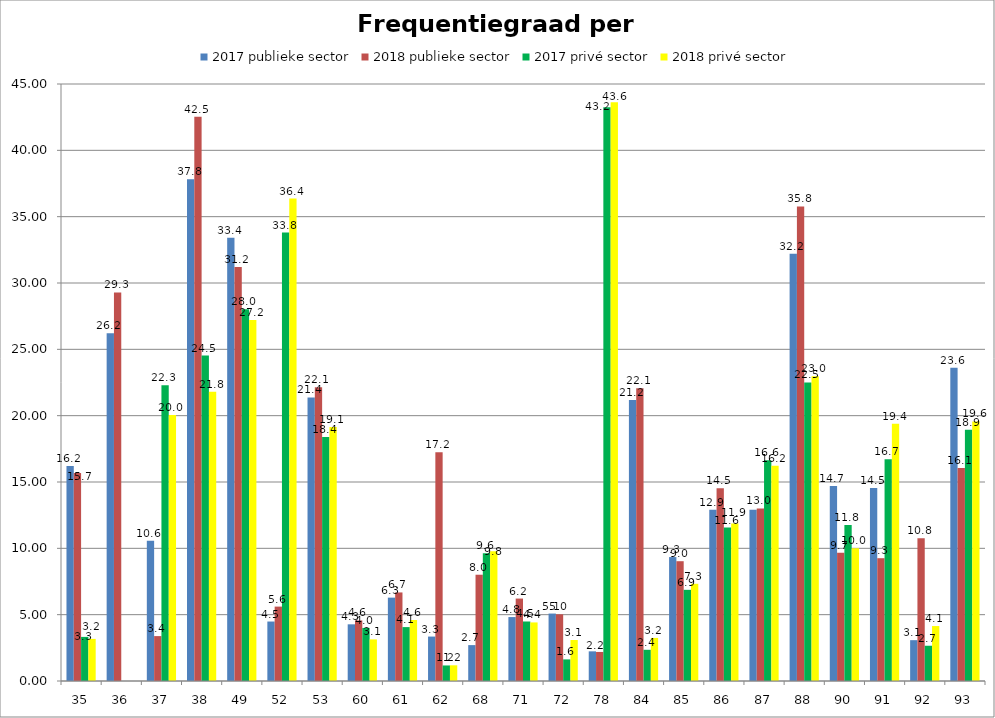
| Category | 2017 publieke sector | 2018 publieke sector | 2017 privé sector | 2018 privé sector |
|---|---|---|---|---|
| 35 | 16.197 | 15.687 | 3.324 | 3.174 |
| 36 | 26.203 | 29.29 | 0 | 0 |
| 37 | 10.573 | 3.384 | 22.29 | 20.05 |
| 38 | 37.816 | 42.537 | 24.535 | 21.796 |
| 49 | 33.407 | 31.215 | 28.027 | 27.205 |
| 52 | 4.483 | 5.608 | 33.804 | 36.364 |
| 53 | 21.375 | 22.148 | 18.392 | 19.148 |
| 60 | 4.272 | 4.566 | 3.999 | 3.135 |
| 61 | 6.284 | 6.676 | 4.063 | 4.597 |
| 62 | 3.349 | 17.25 | 1.172 | 1.184 |
| 68 | 2.705 | 8.01 | 9.635 | 9.787 |
| 71 | 4.819 | 6.213 | 4.485 | 4.415 |
| 72 | 5.083 | 5.027 | 1.628 | 3.089 |
| 78 | 2.235 | 2.189 | 43.248 | 43.627 |
| 84 | 21.172 | 22.068 | 2.353 | 3.247 |
| 85 | 9.341 | 9.029 | 6.872 | 7.327 |
| 86 | 12.899 | 14.529 | 11.565 | 11.867 |
| 87 | 12.909 | 13.01 | 16.646 | 16.216 |
| 88 | 32.199 | 35.775 | 22.505 | 22.975 |
| 90 | 14.691 | 9.667 | 11.758 | 10.008 |
| 91 | 14.549 | 9.256 | 16.713 | 19.395 |
| 92 | 3.078 | 10.756 | 2.657 | 4.142 |
| 93 | 23.603 | 16.059 | 18.936 | 19.562 |